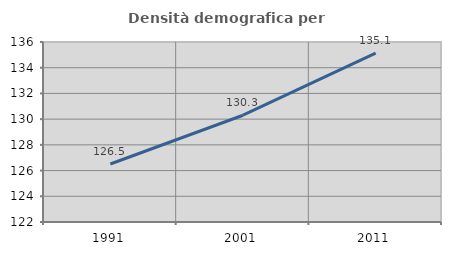
| Category | Densità demografica |
|---|---|
| 1991.0 | 126.512 |
| 2001.0 | 130.304 |
| 2011.0 | 135.136 |